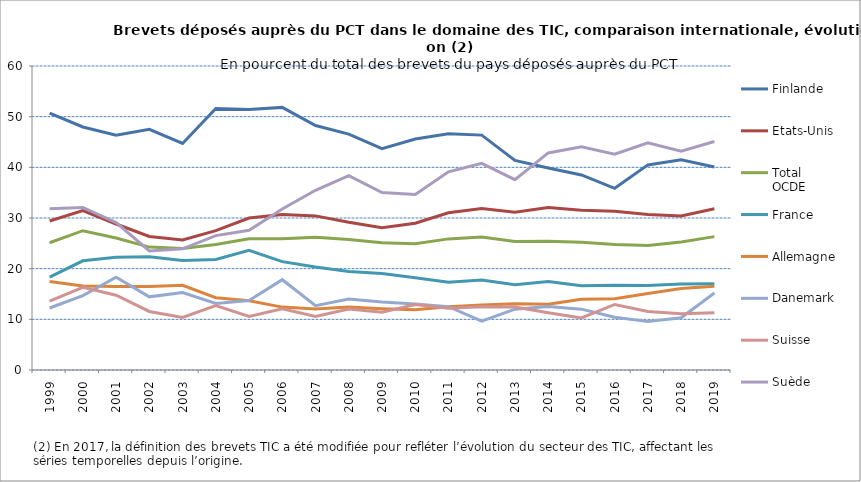
| Category | Finlande | Etats-Unis | Total OCDE | France | Allemagne | Danemark | Suisse | Suède |
|---|---|---|---|---|---|---|---|---|
| 1999.0 | 50.697 | 29.402 | 25.118 | 18.322 | 17.461 | 12.24 | 13.611 | 31.833 |
| 2000.0 | 47.961 | 31.467 | 27.493 | 21.552 | 16.581 | 14.696 | 16.332 | 32.078 |
| 2001.0 | 46.333 | 28.815 | 26.06 | 22.239 | 16.458 | 18.321 | 14.769 | 29.109 |
| 2002.0 | 47.493 | 26.347 | 24.253 | 22.341 | 16.468 | 14.436 | 11.555 | 23.507 |
| 2003.0 | 44.716 | 25.655 | 23.982 | 21.605 | 16.718 | 15.284 | 10.367 | 23.915 |
| 2004.0 | 51.611 | 27.504 | 24.773 | 21.816 | 14.275 | 13.145 | 12.7 | 26.526 |
| 2005.0 | 51.412 | 29.999 | 25.882 | 23.603 | 13.687 | 13.702 | 10.591 | 27.591 |
| 2006.0 | 51.829 | 30.677 | 25.906 | 21.393 | 12.413 | 17.822 | 12.069 | 31.772 |
| 2007.0 | 48.255 | 30.415 | 26.216 | 20.33 | 12.058 | 12.685 | 10.568 | 35.467 |
| 2008.0 | 46.546 | 29.151 | 25.776 | 19.432 | 12.419 | 13.988 | 12.04 | 38.37 |
| 2009.0 | 43.69 | 28.067 | 25.099 | 19.024 | 12.106 | 13.417 | 11.382 | 35.031 |
| 2010.0 | 45.604 | 28.977 | 24.927 | 18.216 | 11.875 | 13.036 | 12.933 | 34.646 |
| 2011.0 | 46.625 | 31.039 | 25.879 | 17.316 | 12.465 | 12.493 | 12.21 | 39.115 |
| 2012.0 | 46.36 | 31.891 | 26.241 | 17.767 | 12.851 | 9.65 | 12.473 | 40.782 |
| 2013.0 | 41.379 | 31.114 | 25.385 | 16.844 | 13.088 | 12.007 | 12.42 | 37.573 |
| 2014.0 | 39.869 | 32.065 | 25.425 | 17.488 | 12.989 | 12.556 | 11.31 | 42.843 |
| 2015.0 | 38.494 | 31.525 | 25.205 | 16.625 | 13.952 | 12.013 | 10.264 | 44.071 |
| 2016.0 | 35.858 | 31.332 | 24.775 | 16.738 | 14.054 | 10.413 | 12.935 | 42.612 |
| 2017.0 | 40.481 | 30.698 | 24.552 | 16.658 | 15.099 | 9.56 | 11.567 | 44.852 |
| 2018.0 | 41.498 | 30.401 | 25.245 | 16.976 | 16.089 | 10.321 | 11.104 | 43.19 |
| 2019.0 | 40.062 | 31.827 | 26.323 | 17.029 | 16.529 | 15.206 | 11.31 | 45.11 |